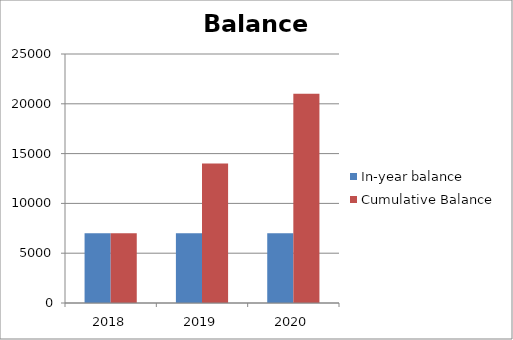
| Category | In-year balance | Cumulative Balance |
|---|---|---|
| 2018.0 | 7000 | 7000 |
| 2019.0 | 7000 | 14000 |
| 2020.0 | 7000 | 21000 |